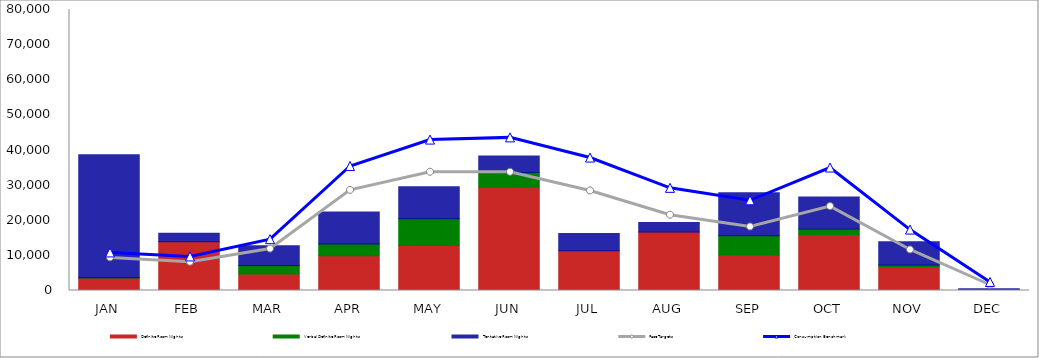
| Category | Definite Room Nights | Verbal Definite Room Nights | Tentative Room Nights |
|---|---|---|---|
| JAN | 3541 | 60 | 35039 |
| FEB | 13900 | 0 | 2397 |
| MAR | 4697 | 2441 | 5600 |
| APR | 9882 | 3360 | 9080 |
| MAY | 12809 | 7583 | 9149 |
| JUN | 29403 | 4198 | 4666 |
| JUL | 11298 | 0 | 4960 |
| AUG | 16663 | 0 | 2700 |
| SEP | 10108 | 5505 | 12202 |
| OCT | 15923 | 1580 | 9123 |
| NOV | 6788 | 450 | 6652 |
| DEC | 150 | 0 | 350 |